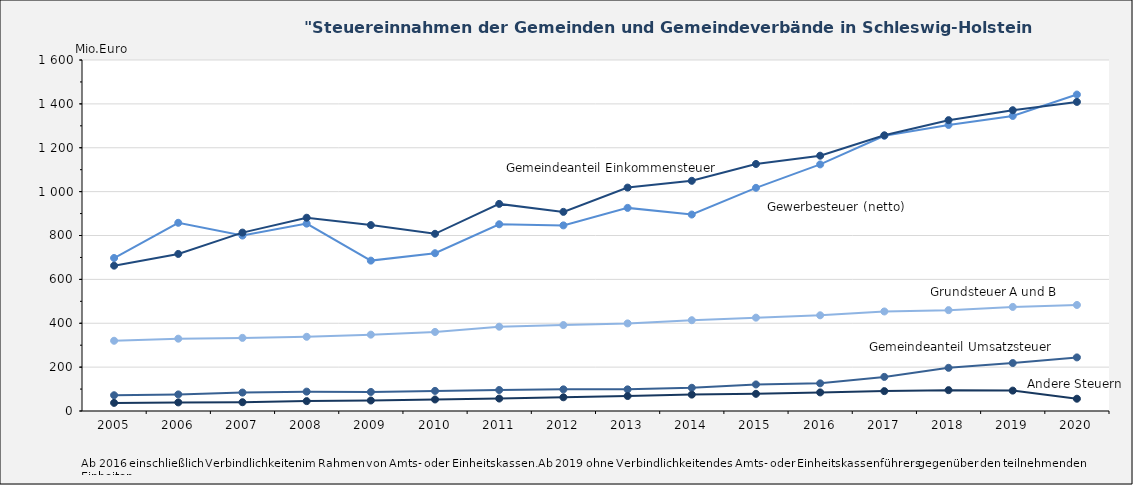
| Category | Grundsteuer A und B | Gewerbesteuer (netto) | Gemeindeanteil 
Einkommensteuer | Gemeindeanteil 
Umsatzsteuer | Andere Steuern |
|---|---|---|---|---|---|
| 2005-12-31 | 320.208 | 697.421 | 662.526 | 71.813 | 37.033 |
| 2006-12-31 | 329.619 | 857.879 | 715.979 | 75.637 | 39.19 |
| 2007-12-31 | 333.269 | 799.759 | 813.207 | 84.102 | 40.034 |
| 2008-12-31 | 338.242 | 854.057 | 880.961 | 88.295 | 45.037 |
| 2009-12-31 | 348.079 | 685.503 | 847.509 | 86.836 | 47.799 |
| 2010-12-31 | 360.489 | 719.131 | 807.797 | 91.705 | 52.512 |
| 2011-12-31 | 384.23 | 851.167 | 944.076 | 95.663 | 56.741 |
| 2012-12-31 | 391.824 | 846.148 | 907.703 | 98.665 | 62.563 |
| 2013-12-31 | 399.274 | 925.865 | 1018.347 | 98.632 | 68.281 |
| 2014-12-31 | 413.857 | 895.581 | 1049.296 | 105.843 | 74.697 |
| 2015-12-31 | 425.536 | 1017.273 | 1126.026 | 121.068 | 78.294 |
| 2016-12-31 | 436.281 | 1124.058 | 1163.786 | 126.118 | 84.757 |
| 2017-12-31 | 453.692 | 1254.583 | 1256.699 | 155.433 | 90.615 |
| 2018-12-31 | 459.815 | 1303.932 | 1325.789 | 196.757 | 95.06 |
| 2019-12-31 | 474.449 | 1344.946 | 1371.082 | 218.59 | 92.893 |
| 2020-12-31 | 483.363 | 1442.559 | 1408.991 | 244.286 | 56.023 |